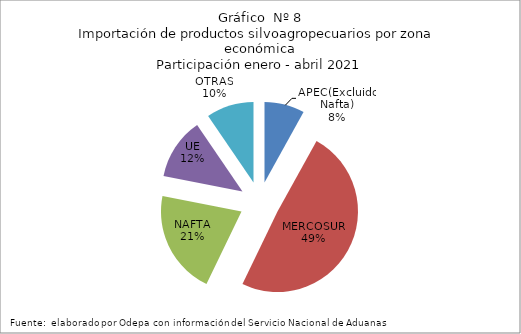
| Category | Series 0 |
|---|---|
| APEC(Excluido Nafta) | 223907.19 |
| MERCOSUR | 1363290.148 |
| NAFTA | 580325.348 |
| UE | 344322.803 |
| OTRAS | 264684.51 |